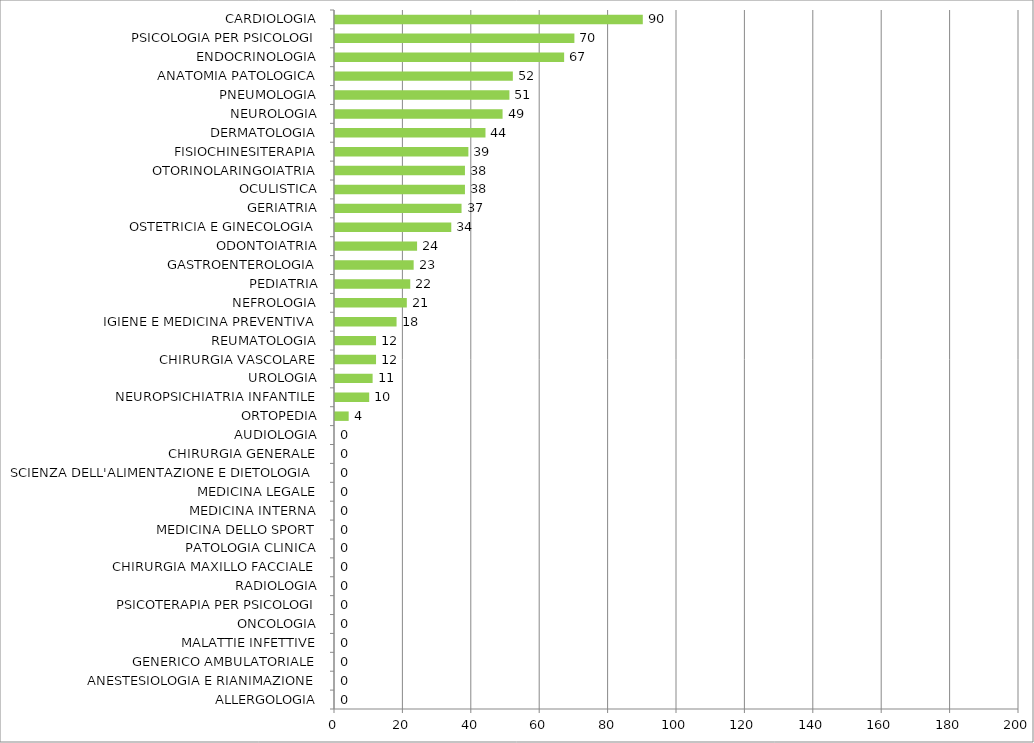
| Category | Series 0 |
|---|---|
| ALLERGOLOGIA | 0 |
| ANESTESIOLOGIA E RIANIMAZIONE | 0 |
| GENERICO AMBULATORIALE | 0 |
| MALATTIE INFETTIVE | 0 |
| ONCOLOGIA | 0 |
| PSICOTERAPIA PER PSICOLOGI | 0 |
| RADIOLOGIA | 0 |
| CHIRURGIA MAXILLO FACCIALE | 0 |
| PATOLOGIA CLINICA | 0 |
| MEDICINA DELLO SPORT | 0 |
| MEDICINA INTERNA | 0 |
| MEDICINA LEGALE | 0 |
| SCIENZA DELL'ALIMENTAZIONE E DIETOLOGIA | 0 |
| CHIRURGIA GENERALE | 0 |
| AUDIOLOGIA | 0 |
| ORTOPEDIA | 4 |
| NEUROPSICHIATRIA INFANTILE | 10 |
| UROLOGIA | 11 |
| CHIRURGIA VASCOLARE | 12 |
| REUMATOLOGIA | 12 |
| IGIENE E MEDICINA PREVENTIVA | 18 |
| NEFROLOGIA | 21 |
| PEDIATRIA | 22 |
| GASTROENTEROLOGIA | 23 |
| ODONTOIATRIA | 24 |
| OSTETRICIA E GINECOLOGIA | 34 |
| GERIATRIA | 37 |
| OCULISTICA | 38 |
| OTORINOLARINGOIATRIA | 38 |
| FISIOCHINESITERAPIA | 39 |
| DERMATOLOGIA | 44 |
| NEUROLOGIA | 49 |
| PNEUMOLOGIA | 51 |
| ANATOMIA PATOLOGICA | 52 |
| ENDOCRINOLOGIA | 67 |
| PSICOLOGIA PER PSICOLOGI | 70 |
| CARDIOLOGIA | 90 |